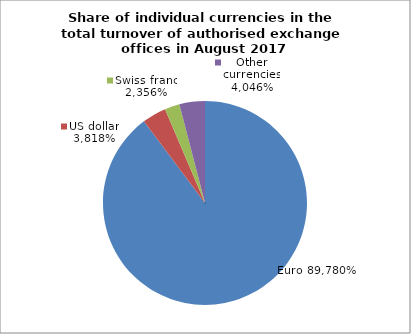
| Category | EUR |
|---|---|
| 0 | 0.898 |
| 1 | 0.038 |
| 2 | 0.024 |
| 3 | 0.04 |